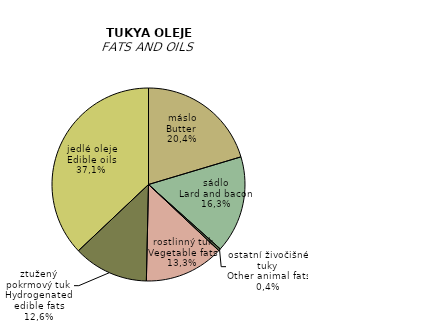
| Category | 2015 |
|---|---|
| máslo  | 5.5 |
| sádlo | 4.39 |
| ostatní živočišné tuky | 0.1 |
| rostlinný tuk | 3.6 |
| ztužený pokrmový tuk | 3.4 |
| jedlé oleje | 10 |